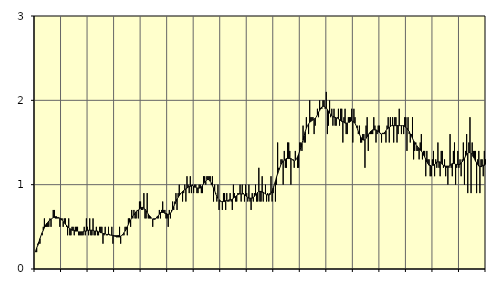
| Category | Sysselsatta utomlands | Series 3 |
|---|---|---|
| nan | 0.2 | 0.21 |
| 87.0 | 0.2 | 0.25 |
| 87.0 | 0.3 | 0.28 |
| 87.0 | 0.3 | 0.32 |
| 87.0 | 0.3 | 0.36 |
| 87.0 | 0.4 | 0.4 |
| 87.0 | 0.4 | 0.43 |
| 87.0 | 0.5 | 0.46 |
| 87.0 | 0.6 | 0.49 |
| 87.0 | 0.5 | 0.52 |
| 87.0 | 0.5 | 0.54 |
| 87.0 | 0.5 | 0.55 |
| nan | 0.5 | 0.57 |
| 88.0 | 0.6 | 0.58 |
| 88.0 | 0.5 | 0.59 |
| 88.0 | 0.6 | 0.6 |
| 88.0 | 0.7 | 0.61 |
| 88.0 | 0.7 | 0.61 |
| 88.0 | 0.6 | 0.62 |
| 88.0 | 0.6 | 0.62 |
| 88.0 | 0.6 | 0.61 |
| 88.0 | 0.6 | 0.61 |
| 88.0 | 0.5 | 0.6 |
| 88.0 | 0.6 | 0.59 |
| nan | 0.6 | 0.58 |
| 89.0 | 0.5 | 0.56 |
| 89.0 | 0.6 | 0.55 |
| 89.0 | 0.6 | 0.53 |
| 89.0 | 0.5 | 0.52 |
| 89.0 | 0.4 | 0.5 |
| 89.0 | 0.6 | 0.49 |
| 89.0 | 0.4 | 0.48 |
| 89.0 | 0.4 | 0.47 |
| 89.0 | 0.5 | 0.46 |
| 89.0 | 0.5 | 0.46 |
| 89.0 | 0.4 | 0.46 |
| nan | 0.5 | 0.45 |
| 90.0 | 0.5 | 0.45 |
| 90.0 | 0.5 | 0.45 |
| 90.0 | 0.4 | 0.44 |
| 90.0 | 0.4 | 0.44 |
| 90.0 | 0.4 | 0.44 |
| 90.0 | 0.4 | 0.44 |
| 90.0 | 0.4 | 0.44 |
| 90.0 | 0.5 | 0.45 |
| 90.0 | 0.4 | 0.45 |
| 90.0 | 0.6 | 0.45 |
| 90.0 | 0.5 | 0.46 |
| nan | 0.4 | 0.46 |
| 91.0 | 0.6 | 0.46 |
| 91.0 | 0.4 | 0.46 |
| 91.0 | 0.4 | 0.46 |
| 91.0 | 0.6 | 0.46 |
| 91.0 | 0.4 | 0.45 |
| 91.0 | 0.4 | 0.45 |
| 91.0 | 0.5 | 0.45 |
| 91.0 | 0.4 | 0.45 |
| 91.0 | 0.4 | 0.44 |
| 91.0 | 0.5 | 0.44 |
| 91.0 | 0.5 | 0.43 |
| nan | 0.5 | 0.43 |
| 92.0 | 0.3 | 0.42 |
| 92.0 | 0.4 | 0.42 |
| 92.0 | 0.5 | 0.42 |
| 92.0 | 0.4 | 0.41 |
| 92.0 | 0.4 | 0.41 |
| 92.0 | 0.5 | 0.41 |
| 92.0 | 0.4 | 0.41 |
| 92.0 | 0.4 | 0.4 |
| 92.0 | 0.5 | 0.4 |
| 92.0 | 0.3 | 0.4 |
| 92.0 | 0.4 | 0.39 |
| nan | 0.4 | 0.39 |
| 93.0 | 0.4 | 0.38 |
| 93.0 | 0.4 | 0.38 |
| 93.0 | 0.4 | 0.38 |
| 93.0 | 0.5 | 0.38 |
| 93.0 | 0.3 | 0.39 |
| 93.0 | 0.4 | 0.4 |
| 93.0 | 0.4 | 0.41 |
| 93.0 | 0.4 | 0.43 |
| 93.0 | 0.5 | 0.45 |
| 93.0 | 0.5 | 0.47 |
| 93.0 | 0.4 | 0.5 |
| nan | 0.6 | 0.53 |
| 94.0 | 0.6 | 0.56 |
| 94.0 | 0.5 | 0.58 |
| 94.0 | 0.7 | 0.61 |
| 94.0 | 0.6 | 0.63 |
| 94.0 | 0.7 | 0.64 |
| 94.0 | 0.6 | 0.66 |
| 94.0 | 0.6 | 0.68 |
| 94.0 | 0.7 | 0.69 |
| 94.0 | 0.6 | 0.7 |
| 94.0 | 0.8 | 0.71 |
| 94.0 | 0.8 | 0.72 |
| nan | 0.7 | 0.73 |
| 95.0 | 0.7 | 0.73 |
| 95.0 | 0.9 | 0.72 |
| 95.0 | 0.6 | 0.71 |
| 95.0 | 0.6 | 0.69 |
| 95.0 | 0.9 | 0.67 |
| 95.0 | 0.6 | 0.65 |
| 95.0 | 0.6 | 0.63 |
| 95.0 | 0.6 | 0.62 |
| 95.0 | 0.6 | 0.6 |
| 95.0 | 0.5 | 0.59 |
| 95.0 | 0.6 | 0.59 |
| nan | 0.6 | 0.59 |
| 96.0 | 0.6 | 0.6 |
| 96.0 | 0.6 | 0.62 |
| 96.0 | 0.6 | 0.63 |
| 96.0 | 0.7 | 0.65 |
| 96.0 | 0.6 | 0.67 |
| 96.0 | 0.7 | 0.67 |
| 96.0 | 0.8 | 0.67 |
| 96.0 | 0.7 | 0.67 |
| 96.0 | 0.7 | 0.66 |
| 96.0 | 0.6 | 0.66 |
| 96.0 | 0.6 | 0.65 |
| nan | 0.5 | 0.65 |
| 97.0 | 0.7 | 0.65 |
| 97.0 | 0.6 | 0.66 |
| 97.0 | 0.7 | 0.68 |
| 97.0 | 0.8 | 0.71 |
| 97.0 | 0.7 | 0.74 |
| 97.0 | 0.8 | 0.77 |
| 97.0 | 0.9 | 0.8 |
| 97.0 | 0.7 | 0.83 |
| 97.0 | 0.9 | 0.85 |
| 97.0 | 1 | 0.87 |
| 97.0 | 0.9 | 0.89 |
| nan | 0.9 | 0.9 |
| 98.0 | 0.8 | 0.92 |
| 98.0 | 0.9 | 0.93 |
| 98.0 | 1 | 0.94 |
| 98.0 | 0.8 | 0.95 |
| 98.0 | 1.1 | 0.96 |
| 98.0 | 1 | 0.97 |
| 98.0 | 0.9 | 0.98 |
| 98.0 | 1.1 | 0.98 |
| 98.0 | 0.9 | 0.99 |
| 98.0 | 1 | 0.99 |
| 98.0 | 0.9 | 0.98 |
| nan | 1 | 0.97 |
| 99.0 | 1 | 0.97 |
| 99.0 | 0.9 | 0.96 |
| 99.0 | 0.9 | 0.96 |
| 99.0 | 1 | 0.96 |
| 99.0 | 1 | 0.96 |
| 99.0 | 0.9 | 0.97 |
| 99.0 | 0.9 | 0.99 |
| 99.0 | 1.1 | 1.01 |
| 99.0 | 1.1 | 1.03 |
| 99.0 | 1 | 1.04 |
| 99.0 | 1.1 | 1.06 |
| nan | 1.1 | 1.06 |
| 0.0 | 1.1 | 1.06 |
| 0.0 | 1.1 | 1.04 |
| 0.0 | 1 | 1.02 |
| 0.0 | 1.1 | 0.99 |
| 0.0 | 0.8 | 0.96 |
| 0.0 | 1 | 0.93 |
| 0.0 | 0.9 | 0.89 |
| 0.0 | 0.8 | 0.86 |
| 0.0 | 1 | 0.84 |
| 0.0 | 0.7 | 0.82 |
| 0.0 | 0.8 | 0.81 |
| nan | 0.8 | 0.8 |
| 1.0 | 0.7 | 0.8 |
| 1.0 | 0.9 | 0.8 |
| 1.0 | 0.9 | 0.8 |
| 1.0 | 0.7 | 0.81 |
| 1.0 | 0.9 | 0.81 |
| 1.0 | 0.8 | 0.81 |
| 1.0 | 0.8 | 0.82 |
| 1.0 | 0.9 | 0.82 |
| 1.0 | 0.8 | 0.82 |
| 1.0 | 0.7 | 0.83 |
| 1.0 | 1 | 0.84 |
| nan | 0.9 | 0.85 |
| 2.0 | 0.8 | 0.86 |
| 2.0 | 0.8 | 0.87 |
| 2.0 | 0.9 | 0.88 |
| 2.0 | 0.9 | 0.89 |
| 2.0 | 1 | 0.89 |
| 2.0 | 0.8 | 0.89 |
| 2.0 | 1 | 0.89 |
| 2.0 | 0.9 | 0.89 |
| 2.0 | 0.8 | 0.88 |
| 2.0 | 1 | 0.87 |
| 2.0 | 0.9 | 0.86 |
| nan | 0.8 | 0.85 |
| 3.0 | 1 | 0.84 |
| 3.0 | 0.8 | 0.84 |
| 3.0 | 0.7 | 0.84 |
| 3.0 | 0.9 | 0.84 |
| 3.0 | 0.8 | 0.85 |
| 3.0 | 0.9 | 0.86 |
| 3.0 | 1 | 0.88 |
| 3.0 | 0.8 | 0.89 |
| 3.0 | 0.8 | 0.91 |
| 3.0 | 1.2 | 0.92 |
| 3.0 | 0.8 | 0.92 |
| nan | 0.8 | 0.92 |
| 4.0 | 1.1 | 0.91 |
| 4.0 | 0.8 | 0.91 |
| 4.0 | 0.9 | 0.9 |
| 4.0 | 1 | 0.89 |
| 4.0 | 0.8 | 0.88 |
| 4.0 | 0.9 | 0.88 |
| 4.0 | 0.8 | 0.88 |
| 4.0 | 0.9 | 0.88 |
| 4.0 | 1.1 | 0.9 |
| 4.0 | 0.8 | 0.92 |
| 4.0 | 0.9 | 0.96 |
| nan | 1 | 1 |
| 5.0 | 0.8 | 1.04 |
| 5.0 | 1 | 1.09 |
| 5.0 | 1.5 | 1.13 |
| 5.0 | 1.2 | 1.17 |
| 5.0 | 1.2 | 1.2 |
| 5.0 | 1.3 | 1.24 |
| 5.0 | 1.3 | 1.26 |
| 5.0 | 1 | 1.28 |
| 5.0 | 1.4 | 1.29 |
| 5.0 | 1.2 | 1.3 |
| 5.0 | 1.2 | 1.31 |
| nan | 1.5 | 1.31 |
| 6.0 | 1.5 | 1.31 |
| 6.0 | 1.4 | 1.31 |
| 6.0 | 1 | 1.31 |
| 6.0 | 1.3 | 1.3 |
| 6.0 | 1.3 | 1.29 |
| 6.0 | 1.2 | 1.28 |
| 6.0 | 1.4 | 1.29 |
| 6.0 | 1.3 | 1.3 |
| 6.0 | 1.2 | 1.33 |
| 6.0 | 1.2 | 1.36 |
| 6.0 | 1.5 | 1.4 |
| nan | 1.5 | 1.44 |
| 7.0 | 1.4 | 1.49 |
| 7.0 | 1.7 | 1.53 |
| 7.0 | 1.5 | 1.58 |
| 7.0 | 1.5 | 1.63 |
| 7.0 | 1.8 | 1.67 |
| 7.0 | 1.7 | 1.7 |
| 7.0 | 1.6 | 1.72 |
| 7.0 | 2 | 1.74 |
| 7.0 | 1.8 | 1.75 |
| 7.0 | 1.8 | 1.76 |
| 7.0 | 1.8 | 1.77 |
| nan | 1.6 | 1.77 |
| 8.0 | 1.7 | 1.79 |
| 8.0 | 1.8 | 1.8 |
| 8.0 | 1.9 | 1.83 |
| 8.0 | 1.8 | 1.86 |
| 8.0 | 2 | 1.88 |
| 8.0 | 1.9 | 1.91 |
| 8.0 | 1.9 | 1.92 |
| 8.0 | 2 | 1.93 |
| 8.0 | 2 | 1.93 |
| 8.0 | 1.9 | 1.92 |
| 8.0 | 2.1 | 1.91 |
| nan | 1.6 | 1.89 |
| 9.0 | 1.7 | 1.87 |
| 9.0 | 2 | 1.85 |
| 9.0 | 1.8 | 1.83 |
| 9.0 | 1.9 | 1.82 |
| 9.0 | 1.7 | 1.81 |
| 9.0 | 1.9 | 1.8 |
| 9.0 | 1.7 | 1.8 |
| 9.0 | 1.7 | 1.79 |
| 9.0 | 1.8 | 1.79 |
| 9.0 | 1.9 | 1.78 |
| 9.0 | 1.7 | 1.77 |
| nan | 1.9 | 1.76 |
| 10.0 | 1.9 | 1.75 |
| 10.0 | 1.5 | 1.75 |
| 10.0 | 1.8 | 1.74 |
| 10.0 | 1.9 | 1.73 |
| 10.0 | 1.6 | 1.73 |
| 10.0 | 1.6 | 1.73 |
| 10.0 | 1.8 | 1.74 |
| 10.0 | 1.8 | 1.74 |
| 10.0 | 1.8 | 1.75 |
| 10.0 | 1.9 | 1.76 |
| 10.0 | 1.5 | 1.75 |
| nan | 1.9 | 1.74 |
| 11.0 | 1.8 | 1.73 |
| 11.0 | 1.7 | 1.7 |
| 11.0 | 1.7 | 1.67 |
| 11.0 | 1.6 | 1.63 |
| 11.0 | 1.7 | 1.6 |
| 11.0 | 1.5 | 1.57 |
| 11.0 | 1.5 | 1.55 |
| 11.0 | 1.6 | 1.53 |
| 11.0 | 1.6 | 1.53 |
| 11.0 | 1.2 | 1.53 |
| 11.0 | 1.7 | 1.55 |
| nan | 1.8 | 1.57 |
| 12.0 | 1.4 | 1.59 |
| 12.0 | 1.6 | 1.61 |
| 12.0 | 1.6 | 1.63 |
| 12.0 | 1.6 | 1.64 |
| 12.0 | 1.6 | 1.65 |
| 12.0 | 1.8 | 1.65 |
| 12.0 | 1.7 | 1.65 |
| 12.0 | 1.5 | 1.65 |
| 12.0 | 1.6 | 1.64 |
| 12.0 | 1.7 | 1.63 |
| 12.0 | 1.7 | 1.62 |
| nan | 1.6 | 1.61 |
| 13.0 | 1.5 | 1.6 |
| 13.0 | 1.6 | 1.61 |
| 13.0 | 1.6 | 1.61 |
| 13.0 | 1.6 | 1.62 |
| 13.0 | 1.5 | 1.64 |
| 13.0 | 1.7 | 1.66 |
| 13.0 | 1.8 | 1.67 |
| 13.0 | 1.5 | 1.68 |
| 13.0 | 1.8 | 1.69 |
| 13.0 | 1.7 | 1.7 |
| 13.0 | 1.8 | 1.7 |
| nan | 1.5 | 1.7 |
| 14.0 | 1.8 | 1.7 |
| 14.0 | 1.8 | 1.7 |
| 14.0 | 1.5 | 1.7 |
| 14.0 | 1.6 | 1.7 |
| 14.0 | 1.9 | 1.7 |
| 14.0 | 1.7 | 1.7 |
| 14.0 | 1.6 | 1.7 |
| 14.0 | 1.7 | 1.7 |
| 14.0 | 1.6 | 1.7 |
| 14.0 | 1.8 | 1.69 |
| 14.0 | 1.8 | 1.68 |
| nan | 1.4 | 1.67 |
| 15.0 | 1.8 | 1.65 |
| 15.0 | 1.6 | 1.63 |
| 15.0 | 1.5 | 1.6 |
| 15.0 | 1.6 | 1.58 |
| 15.0 | 1.8 | 1.55 |
| 15.0 | 1.3 | 1.52 |
| 15.0 | 1.4 | 1.5 |
| 15.0 | 1.5 | 1.48 |
| 15.0 | 1.4 | 1.46 |
| 15.0 | 1.4 | 1.44 |
| 15.0 | 1.3 | 1.43 |
| nan | 1.5 | 1.41 |
| 16.0 | 1.6 | 1.4 |
| 16.0 | 1.3 | 1.38 |
| 16.0 | 1.4 | 1.35 |
| 16.0 | 1.4 | 1.33 |
| 16.0 | 1.1 | 1.3 |
| 16.0 | 1.4 | 1.27 |
| 16.0 | 1.3 | 1.25 |
| 16.0 | 1.3 | 1.23 |
| 16.0 | 1.1 | 1.23 |
| 16.0 | 1.1 | 1.22 |
| 16.0 | 1.3 | 1.23 |
| nan | 1.4 | 1.23 |
| 17.0 | 1.1 | 1.24 |
| 17.0 | 1.3 | 1.25 |
| 17.0 | 1.2 | 1.27 |
| 17.0 | 1.5 | 1.27 |
| 17.0 | 1.2 | 1.27 |
| 17.0 | 1.1 | 1.27 |
| 17.0 | 1.4 | 1.26 |
| 17.0 | 1.4 | 1.24 |
| 17.0 | 1.2 | 1.23 |
| 17.0 | 1.3 | 1.22 |
| 17.0 | 1.1 | 1.22 |
| nan | 1.2 | 1.22 |
| 18.0 | 1 | 1.22 |
| 18.0 | 1.2 | 1.22 |
| 18.0 | 1.6 | 1.23 |
| 18.0 | 1.2 | 1.24 |
| 18.0 | 1.1 | 1.25 |
| 18.0 | 1.4 | 1.25 |
| 18.0 | 1.5 | 1.25 |
| 18.0 | 1 | 1.24 |
| 18.0 | 1.2 | 1.24 |
| 18.0 | 1.4 | 1.24 |
| 18.0 | 1.2 | 1.24 |
| nan | 1.3 | 1.24 |
| 19.0 | 1.1 | 1.26 |
| 19.0 | 1.3 | 1.27 |
| 19.0 | 1.5 | 1.29 |
| 19.0 | 1 | 1.31 |
| 19.0 | 1.4 | 1.34 |
| 19.0 | 1.6 | 1.36 |
| 19.0 | 0.9 | 1.37 |
| 19.0 | 1.5 | 1.38 |
| 19.0 | 1.8 | 1.38 |
| 19.0 | 0.9 | 1.37 |
| 19.0 | 1.5 | 1.36 |
| nan | 1.4 | 1.33 |
| 20.0 | 1.4 | 1.31 |
| 20.0 | 1.4 | 1.28 |
| 20.0 | 0.9 | 1.26 |
| 20.0 | 1.3 | 1.24 |
| 20.0 | 1.4 | 1.22 |
| 20.0 | 0.9 | 1.22 |
| 20.0 | 1.3 | 1.21 |
| 20.0 | 1.3 | 1.22 |
| 20.0 | 1.1 | 1.23 |
| 20.0 | 1.4 | 1.23 |
| 20.0 | 1.3 | 1.24 |